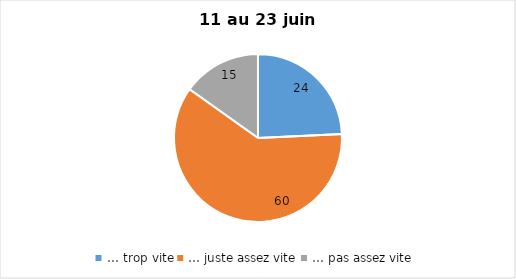
| Category | Series 0 |
|---|---|
| … trop vite | 24 |
| … juste assez vite | 60 |
| … pas assez vite | 15 |